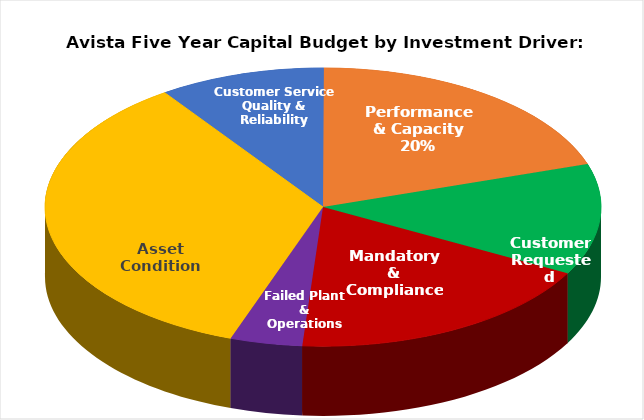
| Category | Series 0 |
|---|---|
| Customer Requested | 0.129 |
| Mandatory & Compliance | 0.183 |
| Failed Plant & Operations | 0.042 |
| Asset Condition | 0.35 |
| Customer Service Quality & Reliability | 0.097 |
| Performance & Capacity | 0.199 |